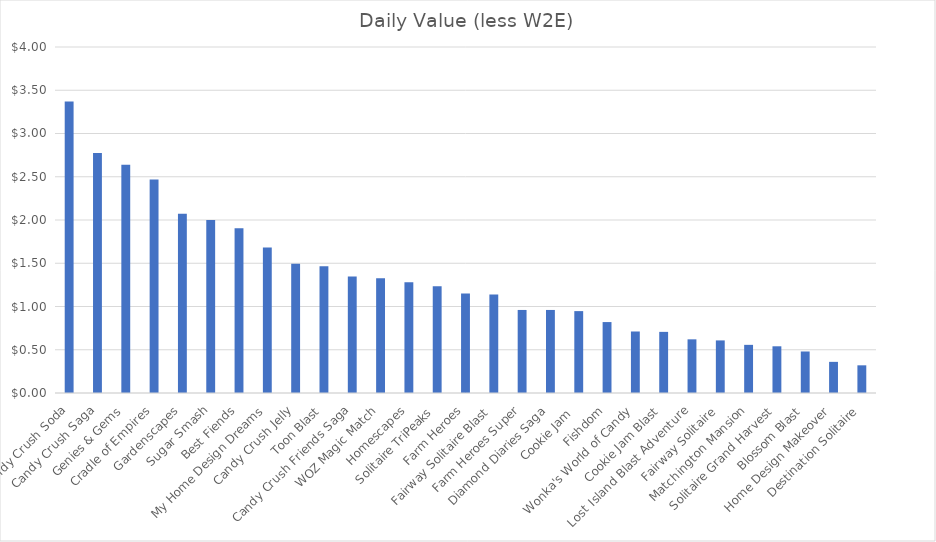
| Category | Daily Value (less W2E) |
|---|---|
| Candy Crush Soda | 3.369 |
| Candy Crush Saga | 2.773 |
| Genies & Gems | 2.64 |
| Cradle of Empires | 2.467 |
| Gardenscapes | 2.073 |
| Sugar Smash | 2 |
| Best Fiends | 1.906 |
| My Home Design Dreams | 1.683 |
| Candy Crush Jelly | 1.493 |
| Toon Blast | 1.467 |
| Candy Crush Friends Saga | 1.348 |
| WOZ Magic Match | 1.327 |
| Homescapes | 1.28 |
| Solitaire TriPeaks | 1.234 |
| Farm Heroes | 1.15 |
| ​​Fairway Solitaire Blast | 1.139 |
| Farm Heroes Super | 0.96 |
| Diamond Diaries Saga | 0.96 |
| Cookie Jam  | 0.947 |
| Fishdom | 0.82 |
| Wonka's World of Candy | 0.711 |
| Cookie Jam Blast | 0.707 |
| Lost Island Blast Adventure | 0.62 |
| ​​Fairway Solitaire | 0.608 |
| Matchington Mansion | 0.557 |
| Solitaire Grand Harvest | 0.54 |
| Blossom Blast | 0.48 |
| Home Design Makeover | 0.36 |
| Destination Solitaire | 0.32 |